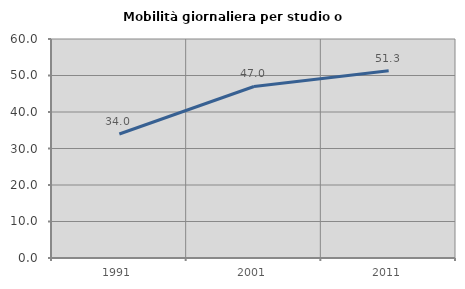
| Category | Mobilità giornaliera per studio o lavoro |
|---|---|
| 1991.0 | 33.963 |
| 2001.0 | 46.996 |
| 2011.0 | 51.318 |